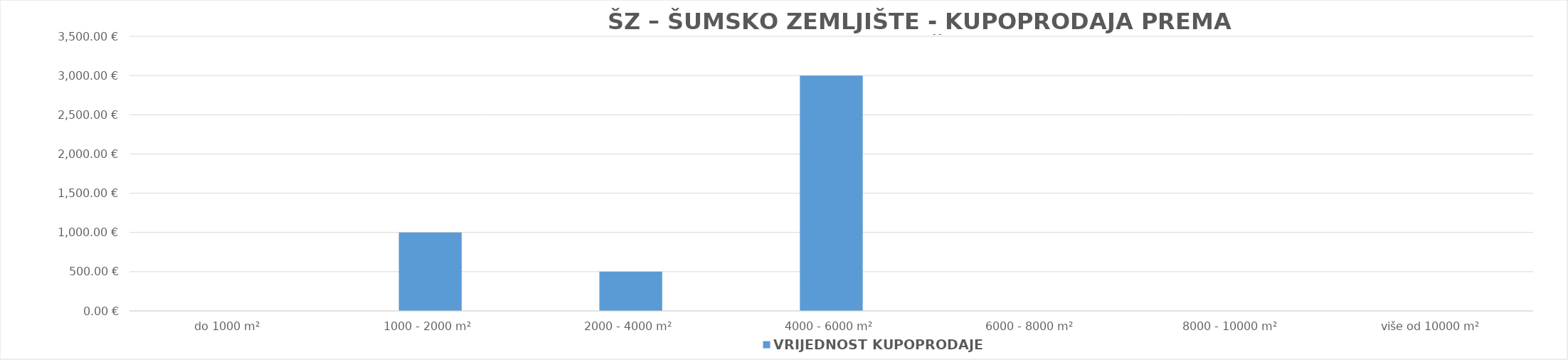
| Category | VRIJEDNOST KUPOPRODAJE 
(u EUR) |
|---|---|
| do 1000 m² | 0 |
| 1000 - 2000 m² | 1000 |
| 2000 - 4000 m² | 500 |
| 4000 - 6000 m² | 3000 |
| 6000 - 8000 m² | 0 |
| 8000 - 10000 m² | 0 |
| više od 10000 m² | 0 |